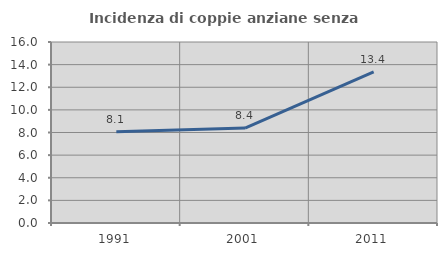
| Category | Incidenza di coppie anziane senza figli  |
|---|---|
| 1991.0 | 8.06 |
| 2001.0 | 8.396 |
| 2011.0 | 13.35 |